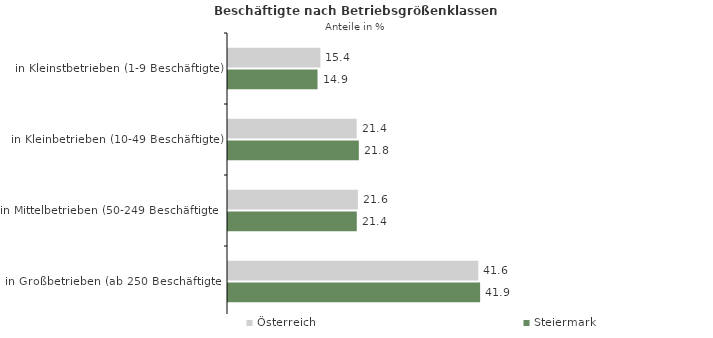
| Category | Österreich | Steiermark |
|---|---|---|
| in Kleinstbetrieben (1-9 Beschäftigte) | 15.366 | 14.89 |
| in Kleinbetrieben (10-49 Beschäftigte) | 21.402 | 21.759 |
| in Mittelbetrieben (50-249 Beschäftigte) | 21.603 | 21.42 |
| in Großbetrieben (ab 250 Beschäftigte) | 41.629 | 41.932 |